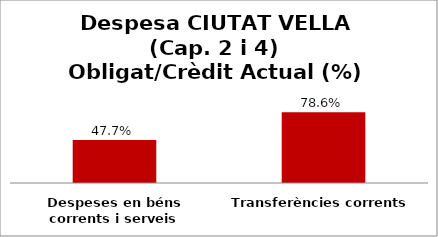
| Category | Series 0 |
|---|---|
| Despeses en béns corrents i serveis | 0.477 |
| Transferències corrents | 0.786 |